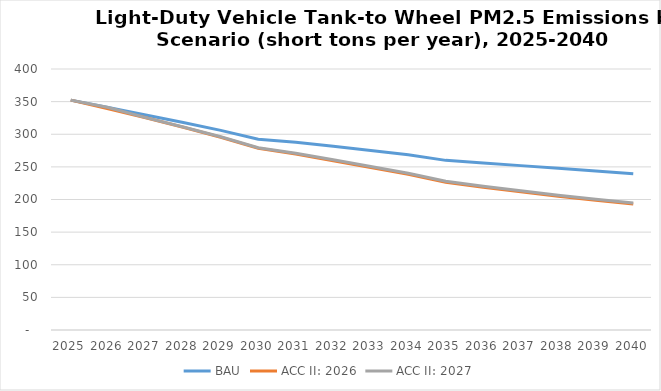
| Category | BAU | ACC II: 2026 | ACC II: 2027 |
|---|---|---|---|
| 2025.0 | 352.318 | 352.318 | 352.318 |
| 2026.0 | 340.965 | 339.112 | 340.965 |
| 2027.0 | 329.606 | 325.202 | 325.521 |
| 2028.0 | 317.944 | 310.657 | 311.17 |
| 2029.0 | 305.984 | 295.481 | 296.197 |
| 2030.0 | 292.398 | 278.526 | 279.437 |
| 2031.0 | 287.716 | 269.804 | 270.93 |
| 2032.0 | 281.514 | 259.53 | 260.846 |
| 2033.0 | 275.116 | 249.092 | 250.565 |
| 2034.0 | 268.568 | 238.61 | 240.203 |
| 2035.0 | 259.969 | 226.452 | 228.114 |
| 2036.0 | 255.95 | 218.745 | 220.453 |
| 2037.0 | 251.917 | 211.702 | 213.4 |
| 2038.0 | 247.723 | 204.92 | 206.57 |
| 2039.0 | 243.598 | 198.834 | 200.379 |
| 2040.0 | 239.33 | 193.117 | 194.509 |